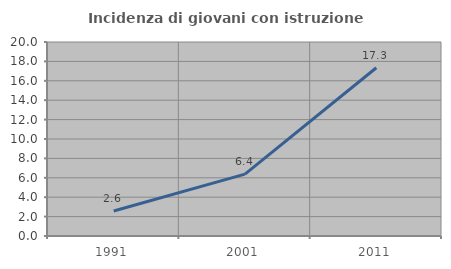
| Category | Incidenza di giovani con istruzione universitaria |
|---|---|
| 1991.0 | 2.574 |
| 2001.0 | 6.374 |
| 2011.0 | 17.347 |